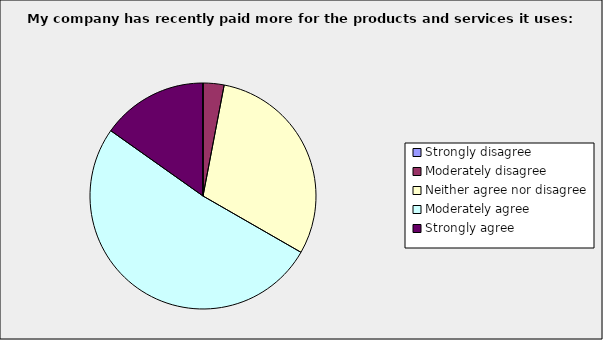
| Category | Series 0 |
|---|---|
| Strongly disagree | 0 |
| Moderately disagree | 0.03 |
| Neither agree nor disagree | 0.303 |
| Moderately agree | 0.515 |
| Strongly agree | 0.152 |